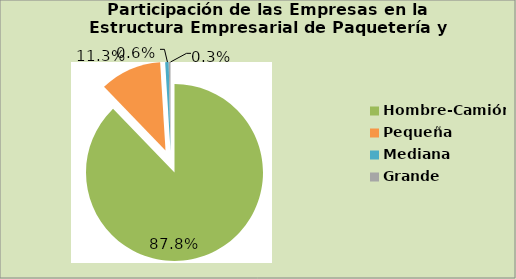
| Category | Series 0 |
|---|---|
| Hombre-Camión | 87.781 |
| Pequeña | 11.254 |
| Mediana | 0.643 |
| Grande | 0.322 |